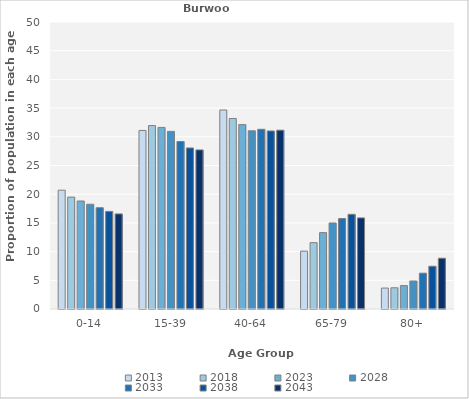
| Category | 2013 | 2018 | 2023 | 2028 | 2033 | 2038 | 2043 |
|---|---|---|---|---|---|---|---|
| 0-14 | 20.697 | 19.493 | 18.815 | 18.249 | 17.647 | 17.006 | 16.562 |
| 15-39 | 31.107 | 31.957 | 31.638 | 30.943 | 29.183 | 28.057 | 27.719 |
| 40-64 | 34.672 | 33.188 | 32.125 | 31.044 | 31.307 | 31.019 | 31.156 |
| 65-79 | 10.082 | 11.558 | 13.31 | 14.983 | 15.752 | 16.497 | 15.875 |
| 80+ | 3.648 | 3.696 | 4.077 | 4.882 | 6.242 | 7.452 | 8.844 |